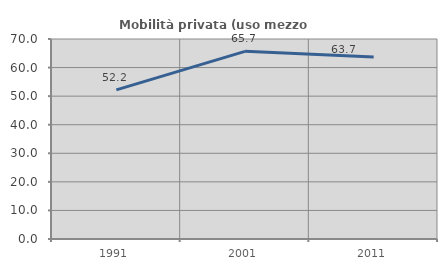
| Category | Mobilità privata (uso mezzo privato) |
|---|---|
| 1991.0 | 52.208 |
| 2001.0 | 65.672 |
| 2011.0 | 63.743 |